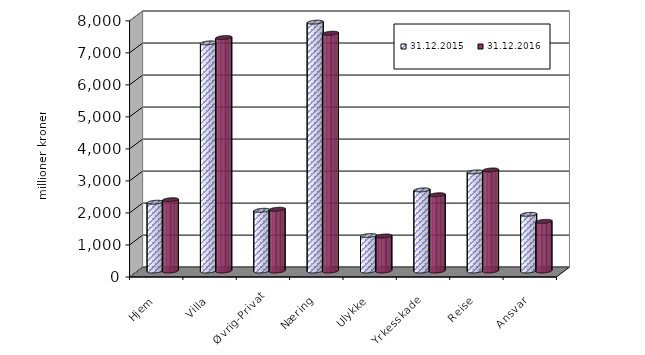
| Category | 31.12.2015 | 31.12.2016 |
|---|---|---|
| Hjem | 2147.501 | 2225.564 |
| Villa | 7124.38 | 7290.958 |
| Øvrig-Privat | 1895.971 | 1928.259 |
| Næring | 7771.738 | 7426.159 |
| Ulykke | 1106.919 | 1091.9 |
| Yrkesskade | 2532.747 | 2381.024 |
| Reise | 3095.825 | 3154.663 |
| Ansvar | 1769.838 | 1550.378 |